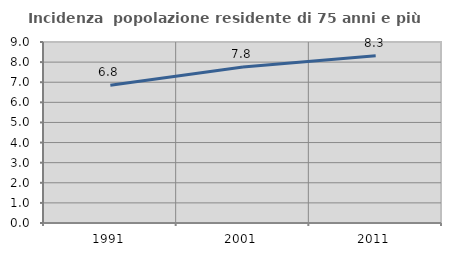
| Category | Incidenza  popolazione residente di 75 anni e più |
|---|---|
| 1991.0 | 6.849 |
| 2001.0 | 7.761 |
| 2011.0 | 8.311 |